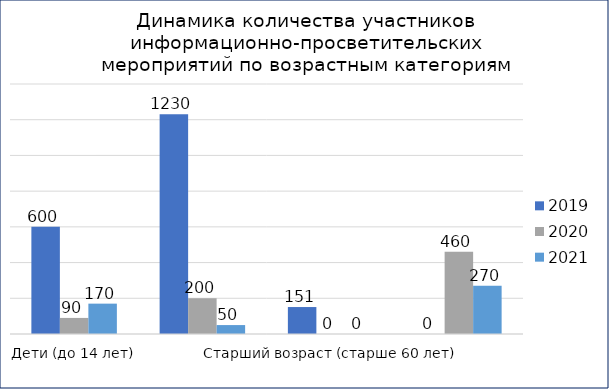
| Category | 2019 | 2020 | 2021 |
|---|---|---|---|
| Дети (до 14 лет) | 600 | 90 | 170 |
| Молодой возраст (14-35 лет) | 1230 | 200 | 50 |
| Старший возраст (старше 60 лет) | 151 | 0 | 0 |
| Смешанный возраст (для любого возраста) | 0 | 460 | 270 |